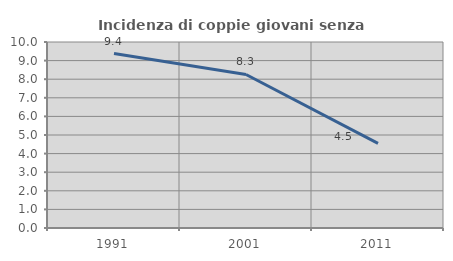
| Category | Incidenza di coppie giovani senza figli |
|---|---|
| 1991.0 | 9.377 |
| 2001.0 | 8.254 |
| 2011.0 | 4.55 |